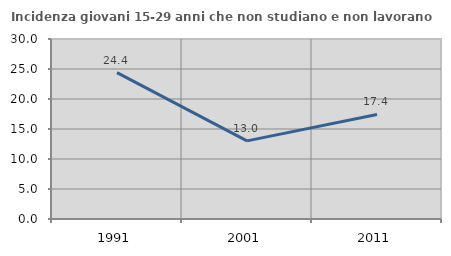
| Category | Incidenza giovani 15-29 anni che non studiano e non lavorano  |
|---|---|
| 1991.0 | 24.39 |
| 2001.0 | 13.024 |
| 2011.0 | 17.422 |